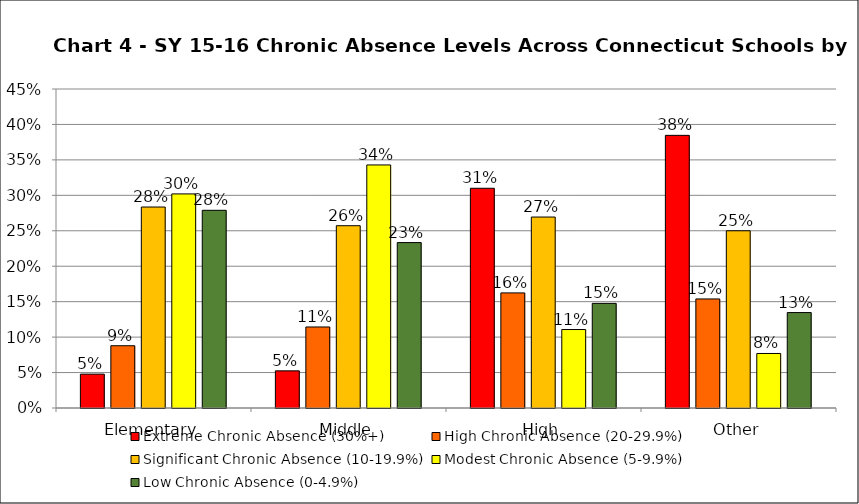
| Category | Extreme Chronic Absence (30%+) | High Chronic Absence (20-29.9%) | Significant Chronic Absence (10-19.9%) | Modest Chronic Absence (5-9.9%) | Low Chronic Absence (0-4.9%) |
|---|---|---|---|---|---|
| 0 | 0.048 | 0.088 | 0.284 | 0.302 | 0.279 |
| 1 | 0.052 | 0.114 | 0.257 | 0.343 | 0.233 |
| 2 | 0.31 | 0.162 | 0.269 | 0.111 | 0.148 |
| 3 | 0.385 | 0.154 | 0.25 | 0.077 | 0.135 |